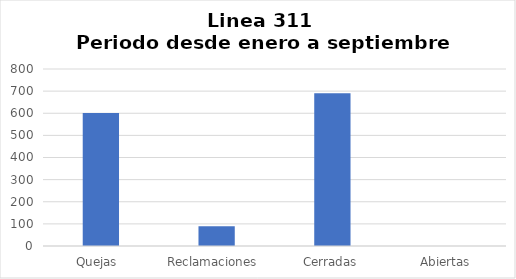
| Category | Series 0 |
|---|---|
| Quejas  | 601 |
| Reclamaciones  | 89 |
| Cerradas | 690 |
| Abiertas  | 0 |